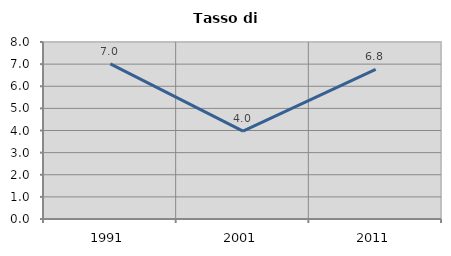
| Category | Tasso di disoccupazione   |
|---|---|
| 1991.0 | 7.015 |
| 2001.0 | 3.968 |
| 2011.0 | 6.76 |